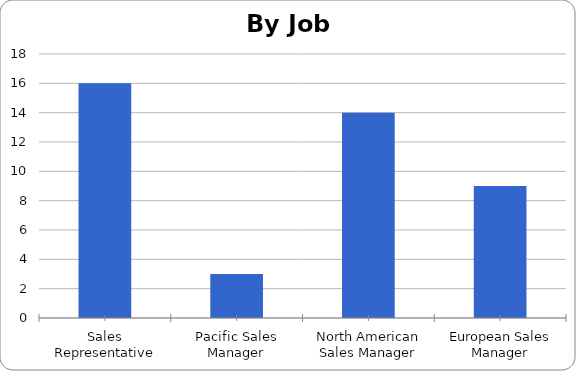
| Category | Series 0 |
|---|---|
| European Sales Manager | 9 |
| North American Sales Manager | 14 |
| Pacific Sales Manager | 3 |
| Sales Representative | 16 |